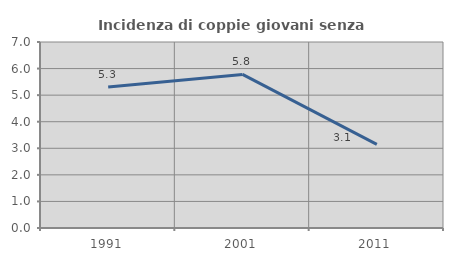
| Category | Incidenza di coppie giovani senza figli |
|---|---|
| 1991.0 | 5.304 |
| 2001.0 | 5.781 |
| 2011.0 | 3.146 |